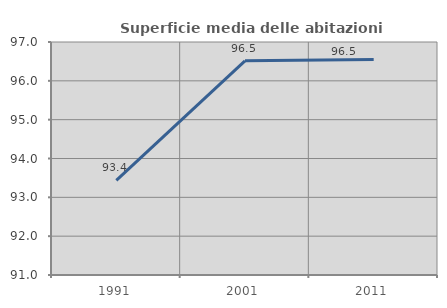
| Category | Superficie media delle abitazioni occupate |
|---|---|
| 1991.0 | 93.435 |
| 2001.0 | 96.515 |
| 2011.0 | 96.548 |